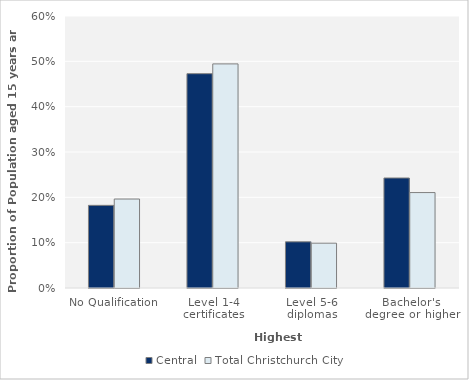
| Category | Central | Total Christchurch City |
|---|---|---|
| No Qualification | 0.182 | 0.196 |
| Level 1-4 certificates | 0.473 | 0.494 |
| Level 5-6 diplomas | 0.102 | 0.099 |
| Bachelor's degree or higher | 0.243 | 0.211 |